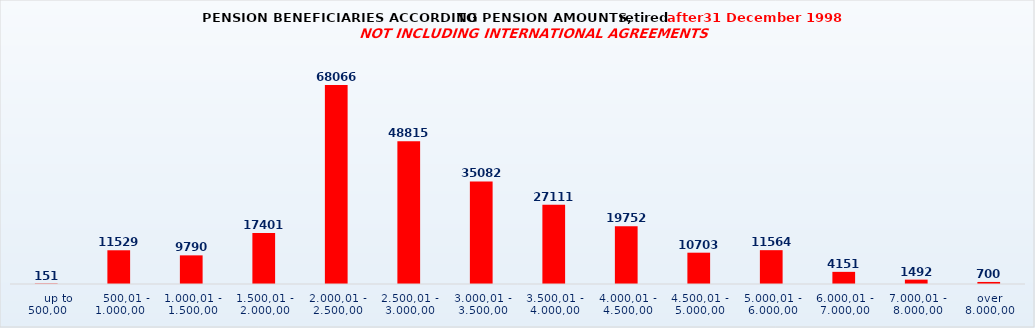
| Category | Series 0 |
|---|---|
|      up to 500,00 | 151 |
|    500,01 - 1.000,00 | 11529 |
| 1.000,01 - 1.500,00 | 9790 |
| 1.500,01 - 2.000,00 | 17401 |
| 2.000,01 - 2.500,00 | 68066 |
| 2.500,01 - 3.000,00 | 48815 |
| 3.000,01 - 3.500,00 | 35082 |
| 3.500,01 - 4.000,00 | 27111 |
| 4.000,01 - 4.500,00 | 19752 |
| 4.500,01 - 5.000,00 | 10703 |
| 5.000,01 - 6.000,00 | 11564 |
| 6.000,01 - 7.000,00 | 4151 |
| 7.000,01 - 8.000,00 | 1492 |
| over 8.000,00 | 700 |